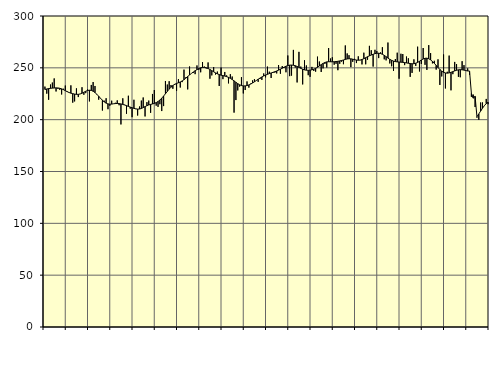
| Category | Piggar | Series 1 |
|---|---|---|
| nan | 231.9 | 229.11 |
| 1.0 | 225.1 | 229.61 |
| 1.0 | 219.2 | 230 |
| 1.0 | 233.9 | 230.23 |
| 1.0 | 235.8 | 230.44 |
| 1.0 | 239.8 | 230.56 |
| 1.0 | 227.2 | 230.68 |
| 1.0 | 229.7 | 230.58 |
| 1.0 | 228.8 | 230.29 |
| 1.0 | 224.3 | 229.74 |
| 1.0 | 229.8 | 228.93 |
| 1.0 | 232.9 | 227.99 |
| nan | 227.5 | 227.02 |
| 2.0 | 226.3 | 226.19 |
| 2.0 | 233.1 | 225.57 |
| 2.0 | 216.4 | 225.09 |
| 2.0 | 217.6 | 224.68 |
| 2.0 | 230.2 | 224.42 |
| 2.0 | 221.8 | 224.43 |
| 2.0 | 224.7 | 224.79 |
| 2.0 | 231.3 | 225.52 |
| 2.0 | 224 | 226.47 |
| 2.0 | 225.6 | 227.41 |
| 2.0 | 229.1 | 228.12 |
| nan | 217.6 | 228.42 |
| 3.0 | 233.5 | 228.21 |
| 3.0 | 236.3 | 227.44 |
| 3.0 | 232.5 | 226.15 |
| 3.0 | 224.8 | 224.49 |
| 3.0 | 219.3 | 222.58 |
| 3.0 | 220.4 | 220.6 |
| 3.0 | 208.8 | 218.73 |
| 3.0 | 218.3 | 217.11 |
| 3.0 | 220.7 | 215.93 |
| 3.0 | 210.1 | 215.21 |
| 3.0 | 213.4 | 214.93 |
| nan | 218.3 | 215.03 |
| 4.0 | 215.4 | 215.31 |
| 4.0 | 216.3 | 215.53 |
| 4.0 | 218.6 | 215.61 |
| 4.0 | 213.9 | 215.5 |
| 4.0 | 195.4 | 215.18 |
| 4.0 | 220.6 | 214.69 |
| 4.0 | 214.4 | 214.12 |
| 4.0 | 205.7 | 213.51 |
| 4.0 | 223.1 | 212.82 |
| 4.0 | 210.6 | 212.14 |
| 4.0 | 202.4 | 211.52 |
| nan | 219.2 | 210.92 |
| 5.0 | 210.2 | 210.43 |
| 5.0 | 204 | 210.19 |
| 5.0 | 212.7 | 210.29 |
| 5.0 | 218.4 | 210.78 |
| 5.0 | 221.4 | 211.63 |
| 5.0 | 203.1 | 212.61 |
| 5.0 | 216.9 | 213.49 |
| 5.0 | 218.4 | 214.2 |
| 5.0 | 206.6 | 214.73 |
| 5.0 | 224.8 | 215.15 |
| 5.0 | 228.6 | 215.68 |
| nan | 213.5 | 216.45 |
| 6.0 | 212.3 | 217.5 |
| 6.0 | 214.9 | 218.95 |
| 6.0 | 208.3 | 220.77 |
| 6.0 | 213.1 | 222.8 |
| 6.0 | 237.3 | 224.97 |
| 6.0 | 233.9 | 227.25 |
| 6.0 | 237.1 | 229.45 |
| 6.0 | 233.4 | 231.37 |
| 6.0 | 229.8 | 232.93 |
| 6.0 | 233.5 | 234.13 |
| 6.0 | 227.8 | 234.96 |
| nan | 239.1 | 235.62 |
| 7.0 | 231 | 236.37 |
| 7.0 | 236.2 | 237.33 |
| 7.0 | 248.3 | 238.57 |
| 7.0 | 240.9 | 240.06 |
| 7.0 | 229.2 | 241.62 |
| 7.0 | 251.3 | 243.13 |
| 7.0 | 244.6 | 244.58 |
| 7.0 | 245.1 | 245.94 |
| 7.0 | 243.9 | 247.19 |
| 7.0 | 252.3 | 248.31 |
| 7.0 | 248 | 249.29 |
| nan | 245.7 | 250.02 |
| 8.0 | 255.6 | 250.42 |
| 8.0 | 251.2 | 250.45 |
| 8.0 | 249.4 | 250.06 |
| 8.0 | 255.2 | 249.34 |
| 8.0 | 239.5 | 248.4 |
| 8.0 | 242.7 | 247.32 |
| 8.0 | 250.7 | 246.19 |
| 8.0 | 243.5 | 245.12 |
| 8.0 | 246.4 | 244.21 |
| 8.0 | 232.5 | 243.51 |
| 8.0 | 250.3 | 242.93 |
| nan | 239.1 | 242.47 |
| 9.0 | 246 | 242.05 |
| 9.0 | 242.7 | 241.51 |
| 9.0 | 235 | 240.8 |
| 9.0 | 243.9 | 239.87 |
| 9.0 | 241.6 | 238.72 |
| 9.0 | 206.8 | 237.42 |
| 9.0 | 218.9 | 236.05 |
| 9.0 | 228.2 | 234.74 |
| 9.0 | 231.9 | 233.65 |
| 9.0 | 241 | 232.91 |
| 9.0 | 225.3 | 232.56 |
| nan | 228.6 | 232.57 |
| 10.0 | 236.9 | 232.91 |
| 10.0 | 230.9 | 233.5 |
| 10.0 | 234.8 | 234.35 |
| 10.0 | 237.9 | 235.4 |
| 10.0 | 239.1 | 236.56 |
| 10.0 | 237.9 | 237.78 |
| 10.0 | 236.5 | 238.99 |
| 10.0 | 239.3 | 240.13 |
| 10.0 | 238.3 | 241.19 |
| 10.0 | 244.6 | 242.12 |
| 10.0 | 240.8 | 242.97 |
| nan | 251.2 | 243.74 |
| 11.0 | 246.3 | 244.42 |
| 11.0 | 240.2 | 245.06 |
| 11.0 | 245 | 245.67 |
| 11.0 | 245.4 | 246.26 |
| 11.0 | 244.6 | 246.98 |
| 11.0 | 252.7 | 247.78 |
| 11.0 | 244.3 | 248.67 |
| 11.0 | 251.7 | 249.67 |
| 11.0 | 249.9 | 250.68 |
| 11.0 | 245.7 | 251.55 |
| 11.0 | 261.9 | 252.19 |
| nan | 242 | 252.59 |
| 12.0 | 242.5 | 252.67 |
| 12.0 | 267.3 | 252.47 |
| 12.0 | 250.3 | 252.04 |
| 12.0 | 235.9 | 251.35 |
| 12.0 | 265.4 | 250.45 |
| 12.0 | 251.2 | 249.5 |
| 12.0 | 234 | 248.65 |
| 12.0 | 257.3 | 248.04 |
| 12.0 | 252.3 | 247.72 |
| 12.0 | 242.9 | 247.65 |
| 12.0 | 241.3 | 247.79 |
| nan | 250.9 | 248.11 |
| 13.0 | 247 | 248.68 |
| 13.0 | 246.3 | 249.51 |
| 13.0 | 260.8 | 250.54 |
| 13.0 | 256.1 | 251.79 |
| 13.0 | 246 | 253.1 |
| 13.0 | 249.5 | 254.26 |
| 13.0 | 253.8 | 255.16 |
| 13.0 | 250.3 | 255.72 |
| 13.0 | 269.1 | 255.88 |
| 13.0 | 259 | 255.86 |
| 13.0 | 260.2 | 255.83 |
| nan | 253 | 255.88 |
| 14.0 | 253.9 | 256.04 |
| 14.0 | 247.7 | 256.31 |
| 14.0 | 253.9 | 256.67 |
| 14.0 | 255.9 | 257.09 |
| 14.0 | 253.5 | 257.57 |
| 14.0 | 271.6 | 258.1 |
| 14.0 | 263.9 | 258.57 |
| 14.0 | 262.2 | 258.8 |
| 14.0 | 250.7 | 258.7 |
| 14.0 | 255.8 | 258.34 |
| 14.0 | 258.7 | 257.89 |
| nan | 254.6 | 257.49 |
| 15.0 | 261.1 | 257.34 |
| 15.0 | 257.3 | 257.53 |
| 15.0 | 253.3 | 258.05 |
| 15.0 | 264.6 | 258.83 |
| 15.0 | 253.4 | 259.8 |
| 15.0 | 257.8 | 260.75 |
| 15.0 | 271.2 | 261.58 |
| 15.0 | 267 | 262.34 |
| 15.0 | 251.2 | 263.07 |
| 15.0 | 267.4 | 263.7 |
| 15.0 | 266.2 | 264.04 |
| nan | 259.4 | 264.1 |
| 16.0 | 264.9 | 263.79 |
| 16.0 | 269.9 | 263.08 |
| 16.0 | 258.2 | 262.05 |
| 16.0 | 257.2 | 260.8 |
| 16.0 | 274.4 | 259.44 |
| 16.0 | 254.2 | 258.2 |
| 16.0 | 251.5 | 257.2 |
| 16.0 | 247 | 256.46 |
| 16.0 | 258.5 | 256.02 |
| 16.0 | 264.6 | 255.75 |
| 16.0 | 239.5 | 255.58 |
| nan | 263.6 | 255.46 |
| 17.0 | 263.3 | 255.29 |
| 17.0 | 252.6 | 255.04 |
| 17.0 | 260.9 | 254.75 |
| 17.0 | 259.2 | 254.45 |
| 17.0 | 241.3 | 254.12 |
| 17.0 | 245.1 | 253.89 |
| 17.0 | 258.2 | 253.97 |
| 17.0 | 251.9 | 254.44 |
| 17.0 | 270.4 | 255.24 |
| 17.0 | 246.5 | 256.29 |
| 17.0 | 253.7 | 257.49 |
| nan | 269.1 | 258.55 |
| 18.0 | 252.9 | 259.2 |
| 18.0 | 248 | 259.32 |
| 18.0 | 271.9 | 258.77 |
| 18.0 | 264.2 | 257.66 |
| 18.0 | 254.3 | 256.16 |
| 18.0 | 256.8 | 254.38 |
| 18.0 | 248.3 | 252.38 |
| 18.0 | 258.2 | 250.31 |
| 18.0 | 233.5 | 248.41 |
| 18.0 | 241.7 | 246.82 |
| 18.0 | 262.9 | 245.69 |
| nan | 230.1 | 245.04 |
| 19.0 | 246.2 | 244.84 |
| 19.0 | 261.8 | 245.11 |
| 19.0 | 228.3 | 245.69 |
| 19.0 | 243.9 | 246.35 |
| 19.0 | 255.7 | 247.04 |
| 19.0 | 253.6 | 247.65 |
| 19.0 | 241.3 | 248.09 |
| 19.0 | 240.9 | 248.25 |
| 19.0 | 256.4 | 248.11 |
| 19.0 | 252.6 | 247.79 |
| 19.0 | 247.2 | 247.33 |
| nan | 249.5 | 246.95 |
| 20.0 | 243.3 | 246.94 |
| 20.0 | 222 | 225.34 |
| 20.0 | 224.2 | 220.74 |
| 20.0 | 212.2 | 222.51 |
| 20.0 | 201.9 | 202.93 |
| 20.0 | 199.9 | 205.53 |
| 20.0 | 216.6 | 208.3 |
| 20.0 | 216.6 | 211.04 |
| 20.0 | 213.3 | 213.5 |
| 20.0 | 220 | 215.46 |
| 20.0 | 214.9 | 216.89 |